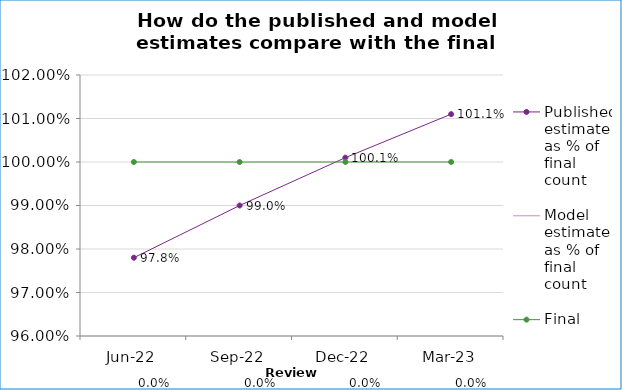
| Category | Published estimate as % of final count | Model estimate as % of final count   | Final count (100%) |
|---|---|---|---|
| 2022-06-01 | 0.978 |  | 1 |
| 2022-09-01 | 0.99 |  | 1 |
| 2022-12-01 | 1.001 |  | 1 |
| 2023-03-01 | 1.011 |  | 1 |